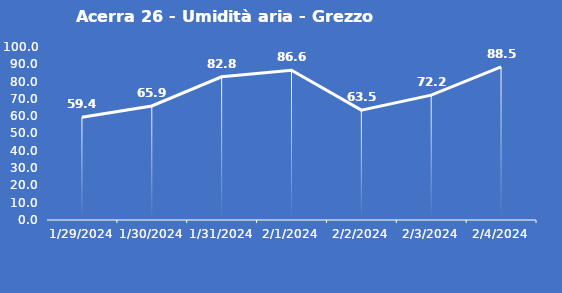
| Category | Acerra 26 - Umidità aria - Grezzo (%) |
|---|---|
| 1/29/24 | 59.4 |
| 1/30/24 | 65.9 |
| 1/31/24 | 82.8 |
| 2/1/24 | 86.6 |
| 2/2/24 | 63.5 |
| 2/3/24 | 72.2 |
| 2/4/24 | 88.5 |